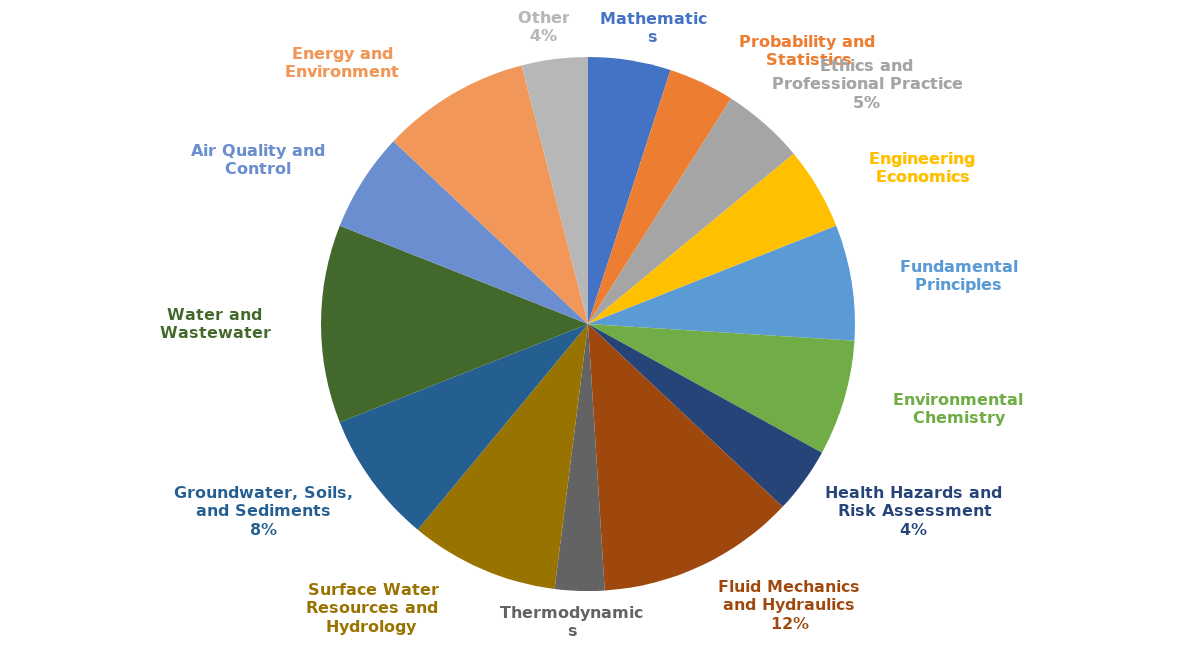
| Category | Series 0 |
|---|---|
| Mathematics | 5 |
| Probability and Statistics | 4 |
| Ethics and Professional Practice | 5 |
| Engineering Economics | 5 |
| Fundamental Principles | 7 |
| Environmental Chemistry | 7 |
| Health Hazards and Risk Assessment | 4 |
| Fluid Mechanics and Hydraulics | 12 |
| Thermodynamics | 3 |
| Surface Water Resources and Hydrology | 9 |
| Groundwater, Soils, and Sediments | 8 |
| Water and Wastewater | 12 |
| Air Quality and Control | 6 |
| Energy and Environment | 9 |